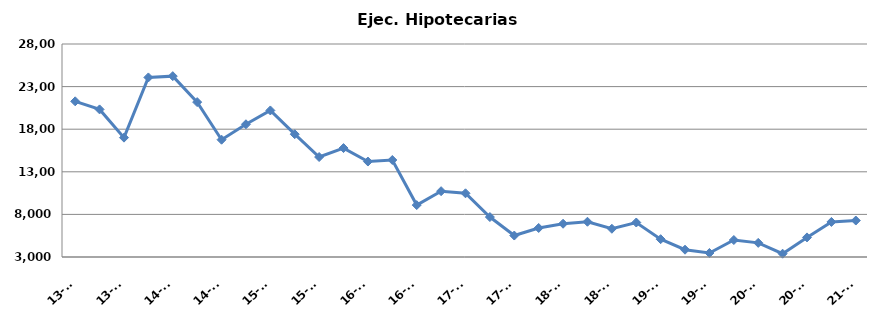
| Category | Monitorios ingresados |
|---|---|
| 13-T1 | 21272 |
| 13-T2 | 20323 |
| 13-T3 | 17009 |
| 13-T4 | 24076 |
| 14-T1 | 24226 |
| 14-T2 | 21178 |
| 14-T3 | 16767 |
| 14-T4 | 18578 |
| 15-T1 | 20201 |
| 15-T2 | 17414 |
| 15-T3 | 14735 |
| 15-T4 | 15785 |
| 16-T1 | 14205 |
| 16-T2 | 14385 |
| 16-T3 | 9094 |
| 16-T4 | 10726 |
| 17-T1 | 10478 |
| 17-T2 | 7689 |
| 17-T3 | 5518 |
| 17-T4 | 6409 |
| 18-T1 | 6903 |
| 18-T2 | 7137 |
| 18-T3 | 6315 |
| 18-T4 | 7049 |
| 19-T1 | 5092 |
| 19-T2 | 3857 |
| 19-T3 | 3470 |
| 19-T4 | 4992 |
| 20-T1 | 4658 |
| 20-T2 | 3387 |
| 20-T3 | 5299 |
| 20-T4 | 7116 |
| 21-T1 | 7280 |